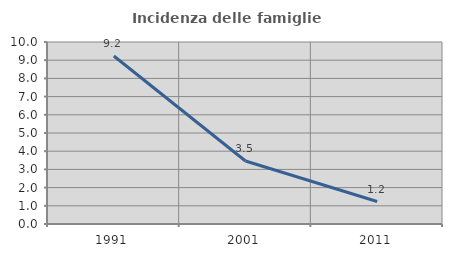
| Category | Incidenza delle famiglie numerose |
|---|---|
| 1991.0 | 9.229 |
| 2001.0 | 3.462 |
| 2011.0 | 1.236 |